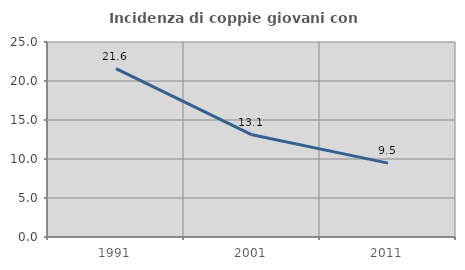
| Category | Incidenza di coppie giovani con figli |
|---|---|
| 1991.0 | 21.589 |
| 2001.0 | 13.102 |
| 2011.0 | 9.47 |